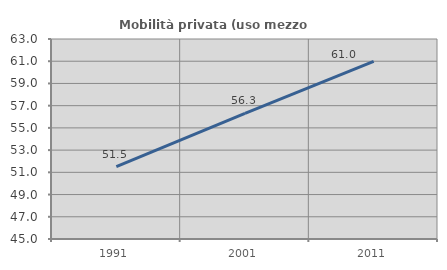
| Category | Mobilità privata (uso mezzo privato) |
|---|---|
| 1991.0 | 51.515 |
| 2001.0 | 56.303 |
| 2011.0 | 60.981 |